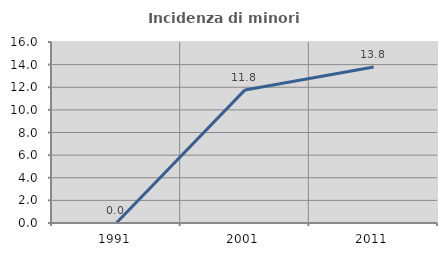
| Category | Incidenza di minori stranieri |
|---|---|
| 1991.0 | 0 |
| 2001.0 | 11.765 |
| 2011.0 | 13.793 |